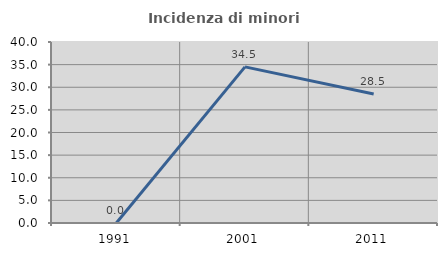
| Category | Incidenza di minori stranieri |
|---|---|
| 1991.0 | 0 |
| 2001.0 | 34.507 |
| 2011.0 | 28.494 |